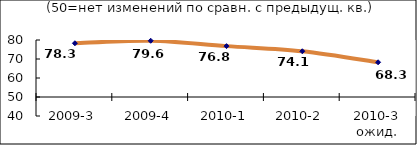
| Category | Диф.индекс ↓ |
|---|---|
| 2009-3 | 78.28 |
| 2009-4 | 79.6 |
| 2010-1 | 76.775 |
| 2010-2 | 74.07 |
| 2010-3 ожид. | 68.26 |